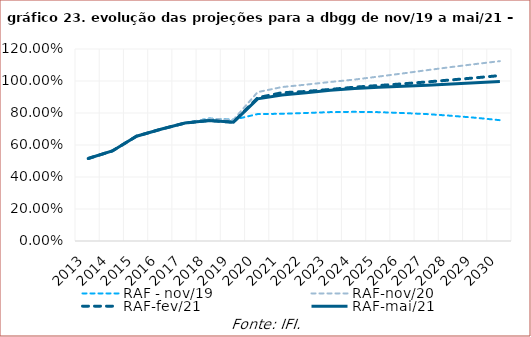
| Category | RAF - nov/19 | RAF-nov/20 | RAF-fev/21 | RAF-mai/21 |
|---|---|---|---|---|
| 2013.0 | 0.515 | 0.515 | 0.515 | 0.515 |
| 2014.0 | 0.563 | 0.563 | 0.563 | 0.563 |
| 2015.0 | 0.655 | 0.655 | 0.655 | 0.655 |
| 2016.0 | 0.698 | 0.698 | 0.698 | 0.698 |
| 2017.0 | 0.737 | 0.737 | 0.737 | 0.737 |
| 2018.0 | 0.765 | 0.765 | 0.753 | 0.753 |
| 2019.0 | 0.758 | 0.758 | 0.743 | 0.743 |
| 2020.0 | 0.793 | 0.931 | 0.896 | 0.888 |
| 2021.0 | 0.795 | 0.962 | 0.927 | 0.913 |
| 2022.0 | 0.8 | 0.977 | 0.935 | 0.927 |
| 2023.0 | 0.806 | 0.994 | 0.947 | 0.942 |
| 2024.0 | 0.807 | 1.009 | 0.962 | 0.953 |
| 2025.0 | 0.805 | 1.028 | 0.972 | 0.961 |
| 2026.0 | 0.8 | 1.048 | 0.982 | 0.967 |
| 2027.0 | 0.793 | 1.068 | 0.994 | 0.974 |
| 2028.0 | 0.783 | 1.088 | 1.007 | 0.981 |
| 2029.0 | 0.77 | 1.106 | 1.02 | 0.989 |
| 2030.0 | 0.755 | 1.124 | 1.034 | 0.997 |